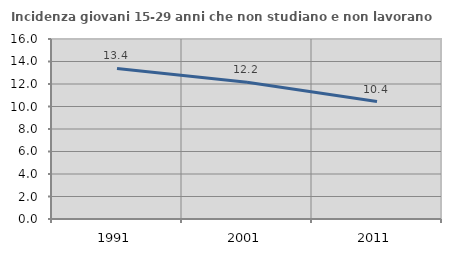
| Category | Incidenza giovani 15-29 anni che non studiano e non lavorano  |
|---|---|
| 1991.0 | 13.379 |
| 2001.0 | 12.162 |
| 2011.0 | 10.44 |